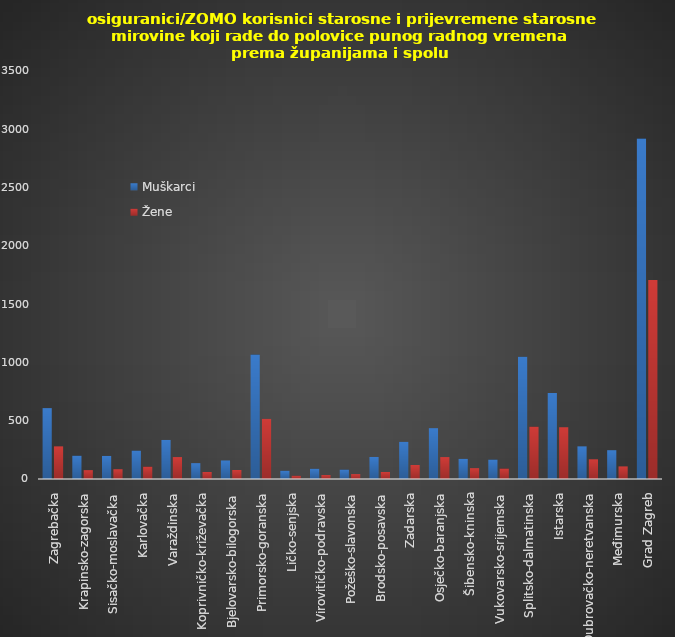
| Category | Muškarci | Žene |
|---|---|---|
| Zagrebačka | 608 | 280 |
| Krapinsko-zagorska | 200 | 76 |
| Sisačko-moslavačka | 198 | 84 |
| Karlovačka | 244 | 106 |
| Varaždinska | 335 | 188 |
| Koprivničko-križevačka | 136 | 60 |
| Bjelovarsko-bilogorska | 159 | 77 |
| Primorsko-goranska | 1067 | 516 |
| Ličko-senjska | 71 | 28 |
| Virovitičko-podravska | 88 | 34 |
| Požeško-slavonska | 81 | 42 |
| Brodsko-posavska | 189 | 60 |
| Zadarska | 319 | 120 |
| Osječko-baranjska | 436 | 188 |
| Šibensko-kninska | 173 | 93 |
| Vukovarsko-srijemska | 167 | 90 |
| Splitsko-dalmatinska | 1049 | 449 |
| Istarska | 737 | 444 |
| Dubrovačko-neretvanska | 280 | 169 |
| Međimurska | 247 | 108 |
| Grad Zagreb | 2920 | 1708 |